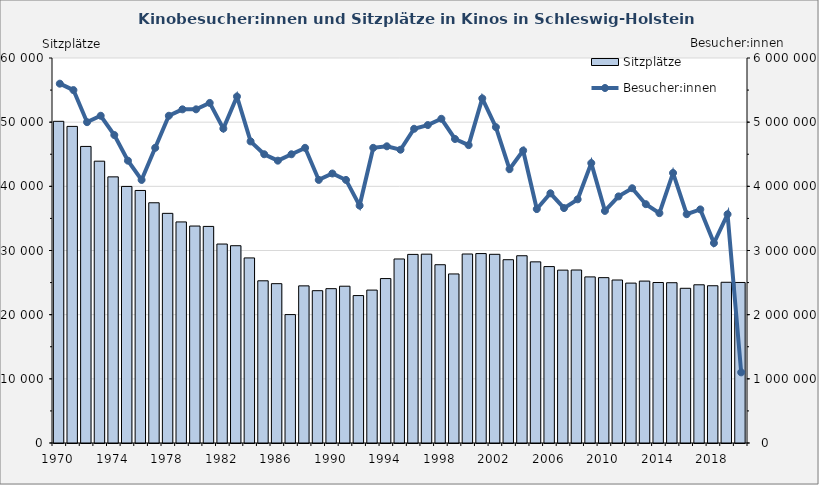
| Category | Sitzplätze |
|---|---|
| 1970.0 | 50131 |
| 1971.0 | 49340 |
| 1972.0 | 46218 |
| 1973.0 | 43920 |
| 1974.0 | 41476 |
| 1975.0 | 39984 |
| 1976.0 | 39356 |
| 1977.0 | 37439 |
| 1978.0 | 35790 |
| 1979.0 | 34452 |
| 1980.0 | 33811 |
| 1981.0 | 33753 |
| 1982.0 | 31007 |
| 1983.0 | 30746 |
| 1984.0 | 28841 |
| 1985.0 | 25277 |
| 1986.0 | 24832 |
| 1987.0 | 20012 |
| 1988.0 | 24488 |
| 1989.0 | 23738 |
| 1990.0 | 24053 |
| 1991.0 | 24435 |
| 1992.0 | 22976 |
| 1993.0 | 23830 |
| 1994.0 | 25626 |
| 1995.0 | 28679 |
| 1996.0 | 29392 |
| 1997.0 | 29428 |
| 1998.0 | 27782 |
| 1999.0 | 26345 |
| 2000.0 | 29453 |
| 2001.0 | 29522 |
| 2002.0 | 29407 |
| 2003.0 | 28564 |
| 2004.0 | 29184 |
| 2005.0 | 28231 |
| 2006.0 | 27493 |
| 2007.0 | 26941 |
| 2008.0 | 26959 |
| 2009.0 | 25887 |
| 2010.0 | 25769 |
| 2011.0 | 25402 |
| 2012.0 | 24920 |
| 2013.0 | 25234 |
| 2014.0 | 25012 |
| 2015.0 | 24979 |
| 2016.0 | 24110 |
| 2017.0 | 24656 |
| 2018.0 | 24507 |
| 2019.0 | 25048 |
| 2020.0 | 25018 |